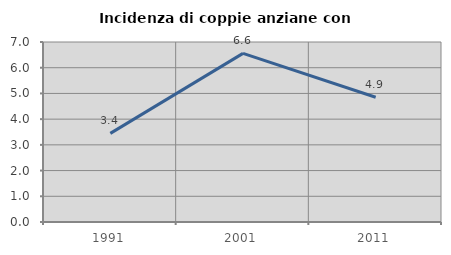
| Category | Incidenza di coppie anziane con figli |
|---|---|
| 1991.0 | 3.445 |
| 2001.0 | 6.557 |
| 2011.0 | 4.85 |